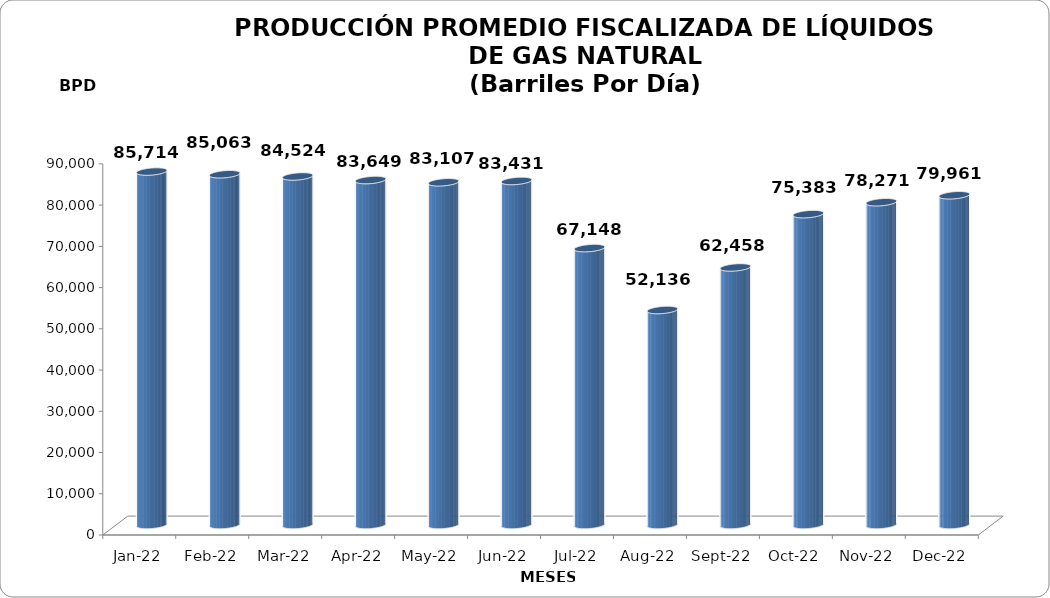
| Category | Series 0 |
|---|---|
| 2022-01-01 | 85714.355 |
| 2022-02-01 | 85063 |
| 2022-03-01 | 84523.548 |
| 2022-04-01 | 83649 |
| 2022-05-01 | 83107.387 |
| 2022-06-01 | 83430.867 |
| 2022-07-01 | 67147.806 |
| 2022-08-01 | 52135.548 |
| 2022-09-01 | 62458.2 |
| 2022-10-01 | 75383.161 |
| 2022-11-01 | 78270.633 |
| 2022-12-01 | 79961.258 |